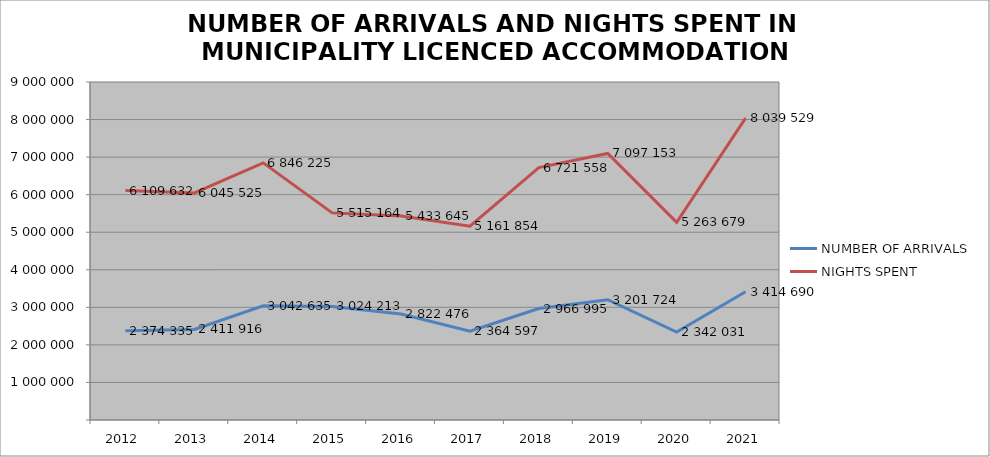
| Category | NUMBER OF ARRIVALS | NIGHTS SPENT |
|---|---|---|
| 2012 | 2374335 | 6109632 |
| 2013 | 2411916 | 6045525 |
| 2014 | 3042635 | 6846225 |
| 2015 | 3024213 | 5515164 |
| 2016 | 2822476 | 5433645 |
| 2017 | 2364597 | 5161854 |
| 2018 | 2966995 | 6721558 |
| 2019 | 3201724 | 7097153 |
| 2020 | 2342031 | 5263679 |
| 2021 | 3414690 | 8039529 |